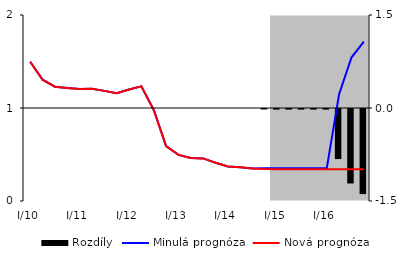
| Category | Rozdíly |
|---|---|
| 0 | 0 |
| 1 | 0 |
| 2 | 0 |
| 3 | 0 |
| 4 | 0 |
| 5 | 0 |
| 6 | 0 |
| 7 | 0 |
| 8 | 0 |
| 9 | 0 |
| 10 | 0 |
| 11 | 0 |
| 12 | 0 |
| 13 | 0 |
| 14 | 0 |
| 15 | 0 |
| 16 | 0 |
| 17 | 0 |
| 18 | 0 |
| 19 | -0.007 |
| 20 | -0.01 |
| 21 | -0.01 |
| 22 | -0.01 |
| 23 | -0.01 |
| 24 | -0.01 |
| 25 | -0.807 |
| 26 | -1.202 |
| 27 | -1.372 |